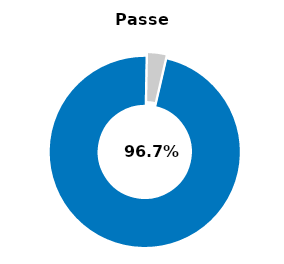
| Category | Series 0 |
|---|---|
| Passed | 0.967 |
| Other | 0.033 |